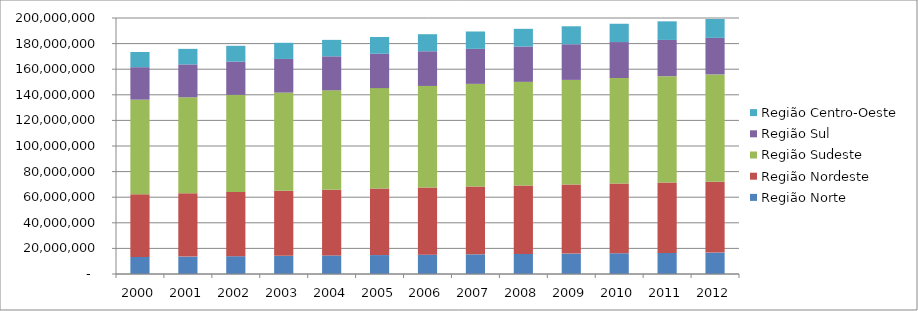
| Category | Região Norte | Região Nordeste | Região Sudeste | Região Sul | Região Centro-Oeste |
|---|---|---|---|---|---|
| 2000.0 | 13270654 | 48946038 | 73974228 | 25386219 | 11871208 |
| 2001.0 | 13578120 | 49573070 | 74925027 | 25692035 | 12116977 |
| 2002.0 | 13884716 | 50188084 | 75852218 | 25989162 | 12361948 |
| 2003.0 | 14189708 | 50789908 | 76755340 | 26278032 | 12606120 |
| 2004.0 | 14492037 | 51376866 | 77634148 | 26559000 | 12849436 |
| 2005.0 | 14790808 | 51947102 | 78488527 | 26832459 | 13091910 |
| 2006.0 | 15085215 | 52499041 | 79318449 | 27098800 | 13333632 |
| 2007.0 | 15374524 | 53031557 | 80123750 | 27358348 | 13574576 |
| 2008.0 | 15658112 | 53543869 | 80904319 | 27611414 | 13814725 |
| 2009.0 | 15935514 | 54035553 | 81660443 | 27858309 | 14054150 |
| 2010.0 | 16206409 | 54506351 | 82392683 | 28099409 | 14292945 |
| 2011.0 | 16471131 | 54955883 | 83103755 | 28336491 | 14529758 |
| 2012.0 | 16730156 | 55384833 | 83795056 | 28569231 | 14763186 |